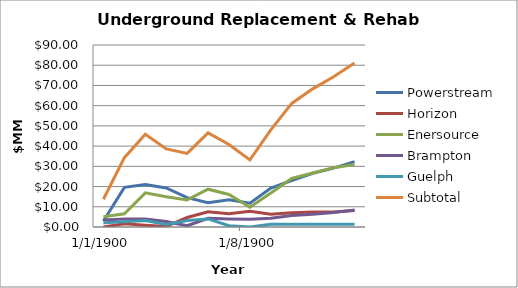
| Category | Powerstream  | Horizon  | Enersource  | Brampton  | Guelph  | Subtotal  |
|---|---|---|---|---|---|---|
| 0 | 3 | 0 | 5.1 | 3.5 | 2.1 | 13.7 |
| 1 | 19.6 | 1.6 | 6.5 | 4 | 2.6 | 34.3 |
| 2 | 21 | 0.9 | 16.9 | 3.9 | 3.2 | 45.9 |
| 3 | 19.3 | 0.3 | 15 | 2.7 | 1.3 | 38.6 |
| 4 | 14.5 | 4.7 | 13.4 | 0.6 | 3.2 | 36.4 |
| 5 | 12 | 7.5 | 18.7 | 4.3 | 4 | 46.5 |
| 6 | 13.5 | 6.6 | 16.1 | 4 | 0.6 | 40.8 |
| 7 | 11.8 | 7.8 | 9.8 | 3.8 | 0 | 33.2 |
| 8 | 19.3 | 6.3 | 16.8 | 4.3 | 1.3 | 48 |
| 9 | 23 | 7.1 | 24 | 5.7 | 1.3 | 61.1 |
| 10 | 26.6 | 7.4 | 26.7 | 6.3 | 1.3 | 68.3 |
| 11 | 29.1 | 7.4 | 29.3 | 7.2 | 1.3 | 74.3 |
| 12 | 32.3 | 8.1 | 30.9 | 8.4 | 1.4 | 81.1 |